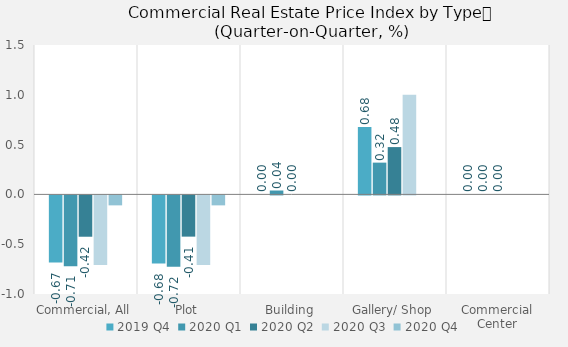
| Category | 2019 | 2020 |
|---|---|---|
| Commercial, All | -0.674 | -0.1 |
| Plot | -0.684 | -0.1 |
| Building | 0 | 0 |
| Gallery/ Shop | 0.677 | 0 |
| Commercial Center | 0 | 0 |